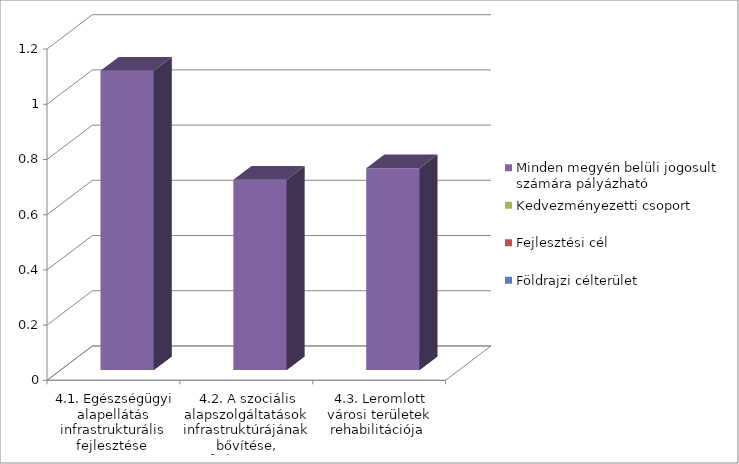
| Category | Földrajzi célterület  | Fejlesztési cél  | Kedvezményezetti csoport | Minden megyén belüli jogosult számára pályázható   |
|---|---|---|---|---|
| 4.1. Egészségügyi alapellátás infrastrukturális fejlesztése | 0 | 0 | 0 | 1.084 |
| 4.2. A szociális alapszolgáltatások infrastruktúrájának bővítése, fejlesztése | 0 | 0 | 0 | 0.689 |
| 4.3. Leromlott városi területek rehabilitációja | 0 | 0 | 0 | 0.731 |